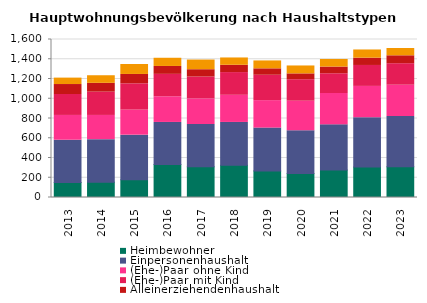
| Category | Heimbewohner | Einpersonenhaushalt | (Ehe-)Paar ohne Kind | (Ehe-)Paar mit Kind | Alleinerziehendenhaushalt | sonstiger Mehrpersonenhaushalt |
|---|---|---|---|---|---|---|
| 2013.0 | 152 | 428 | 251 | 212 | 101 | 65 |
| 2014.0 | 155 | 431 | 245 | 236 | 89 | 77 |
| 2015.0 | 179 | 452 | 254 | 266 | 95 | 101 |
| 2016.0 | 335 | 425 | 260 | 227 | 80 | 83 |
| 2017.0 | 311 | 428 | 260 | 221 | 74 | 98 |
| 2018.0 | 326 | 434 | 275 | 230 | 74 | 74 |
| 2019.0 | 269 | 434 | 278 | 257 | 65 | 80 |
| 2020.0 | 242 | 434 | 299 | 218 | 59 | 80 |
| 2021.0 | 278 | 458 | 317 | 200 | 68 | 77 |
| 2022.0 | 308 | 500 | 317 | 212 | 74 | 83 |
| 2023.0 | 311 | 509 | 317 | 218 | 80 | 74 |